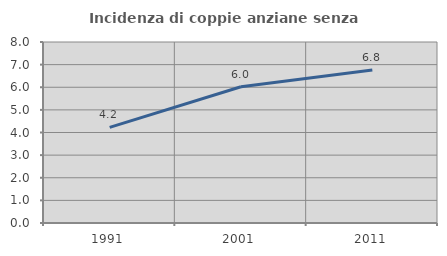
| Category | Incidenza di coppie anziane senza figli  |
|---|---|
| 1991.0 | 4.227 |
| 2001.0 | 6.021 |
| 2011.0 | 6.765 |